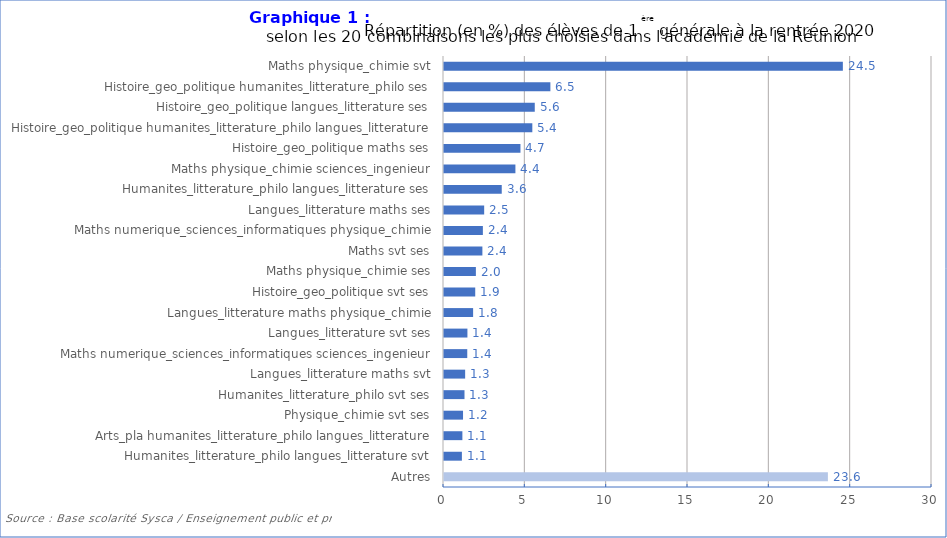
| Category | Series 1 |
|---|---|
| Autres | 23.6 |
| Humanites_litterature_philo langues_litterature svt | 1.1 |
| Arts_pla humanites_litterature_philo langues_litterature | 1.13 |
| Physique_chimie svt ses | 1.17 |
| Humanites_litterature_philo svt ses | 1.26 |
| Langues_litterature maths svt | 1.3 |
| Maths numerique_sciences_informatiques sciences_ingenieur | 1.43 |
| Langues_litterature svt ses | 1.44 |
| Langues_litterature maths physique_chimie | 1.79 |
| Histoire_geo_politique svt ses | 1.92 |
| Maths physique_chimie ses | 1.96 |
| Maths svt ses | 2.36 |
| Maths numerique_sciences_informatiques physique_chimie | 2.39 |
| Langues_litterature maths ses | 2.47 |
| Humanites_litterature_philo langues_litterature ses | 3.55 |
| Maths physique_chimie sciences_ingenieur | 4.39 |
| Histoire_geo_politique maths ses | 4.7 |
| Histoire_geo_politique humanites_litterature_philo langues_litterature | 5.43 |
| Histoire_geo_politique langues_litterature ses | 5.58 |
| Histoire_geo_politique humanites_litterature_philo ses | 6.54 |
| Maths physique_chimie svt | 24.52 |